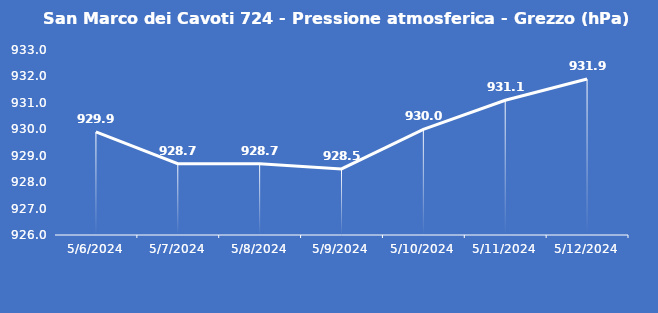
| Category | San Marco dei Cavoti 724 - Pressione atmosferica - Grezzo (hPa) |
|---|---|
| 5/6/24 | 929.9 |
| 5/7/24 | 928.7 |
| 5/8/24 | 928.7 |
| 5/9/24 | 928.5 |
| 5/10/24 | 930 |
| 5/11/24 | 931.1 |
| 5/12/24 | 931.9 |